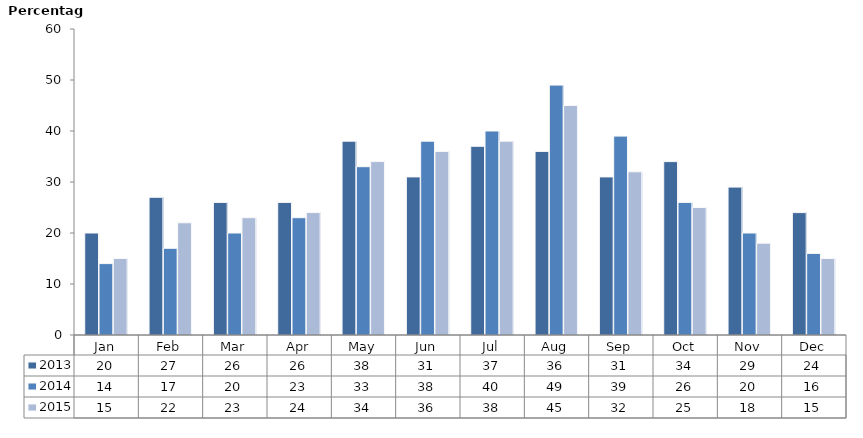
| Category | 2013 | 2014 | 2015 |
|---|---|---|---|
| Jan | 20 | 14 | 15 |
| Feb | 27 | 17 | 22 |
| Mar | 26 | 20 | 23 |
| Apr | 26 | 23 | 24 |
| May | 38 | 33 | 34 |
| Jun | 31 | 38 | 36 |
| Jul | 37 | 40 | 38 |
| Aug | 36 | 49 | 45 |
| Sep | 31 | 39 | 32 |
| Oct | 34 | 26 | 25 |
| Nov | 29 | 20 | 18 |
| Dec | 24 | 16 | 15 |